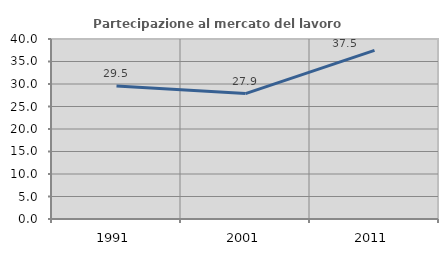
| Category | Partecipazione al mercato del lavoro  femminile |
|---|---|
| 1991.0 | 29.542 |
| 2001.0 | 27.871 |
| 2011.0 | 37.484 |